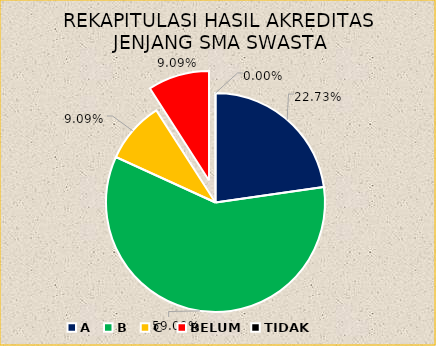
| Category | REKAPITULASI HASIL AKREDITASI JENJANG SMA SWASTA |
|---|---|
| A | 5 |
| B | 13 |
| C | 2 |
| BELUM | 2 |
| TIDAK | 0 |